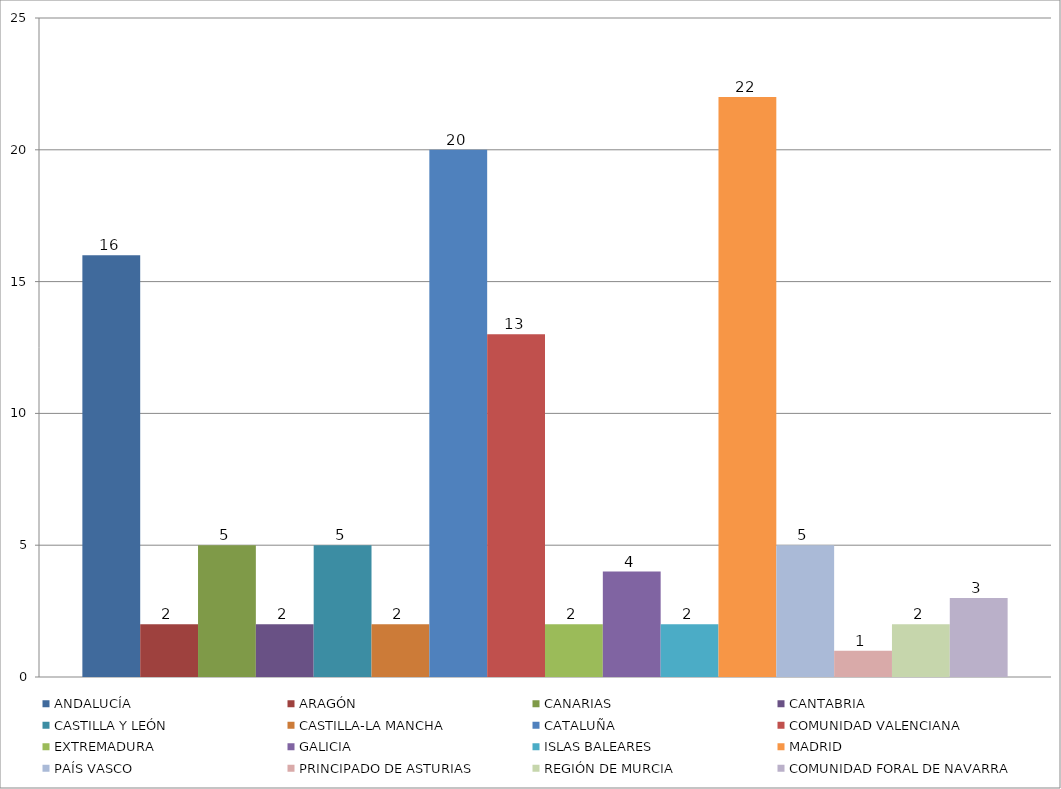
| Category | ANDALUCÍA | ARAGÓN | CANARIAS | CANTABRIA | CASTILLA Y LEÓN | CASTILLA-LA MANCHA | CATALUÑA | COMUNIDAD VALENCIANA | EXTREMADURA | GALICIA | ISLAS BALEARES | MADRID | PAÍS VASCO | PRINCIPADO DE ASTURIAS | REGIÓN DE MURCIA | COMUNIDAD FORAL DE NAVARRA |
|---|---|---|---|---|---|---|---|---|---|---|---|---|---|---|---|---|
| Total | 16 | 2 | 5 | 2 | 5 | 2 | 20 | 13 | 2 | 4 | 2 | 22 | 5 | 1 | 2 | 3 |